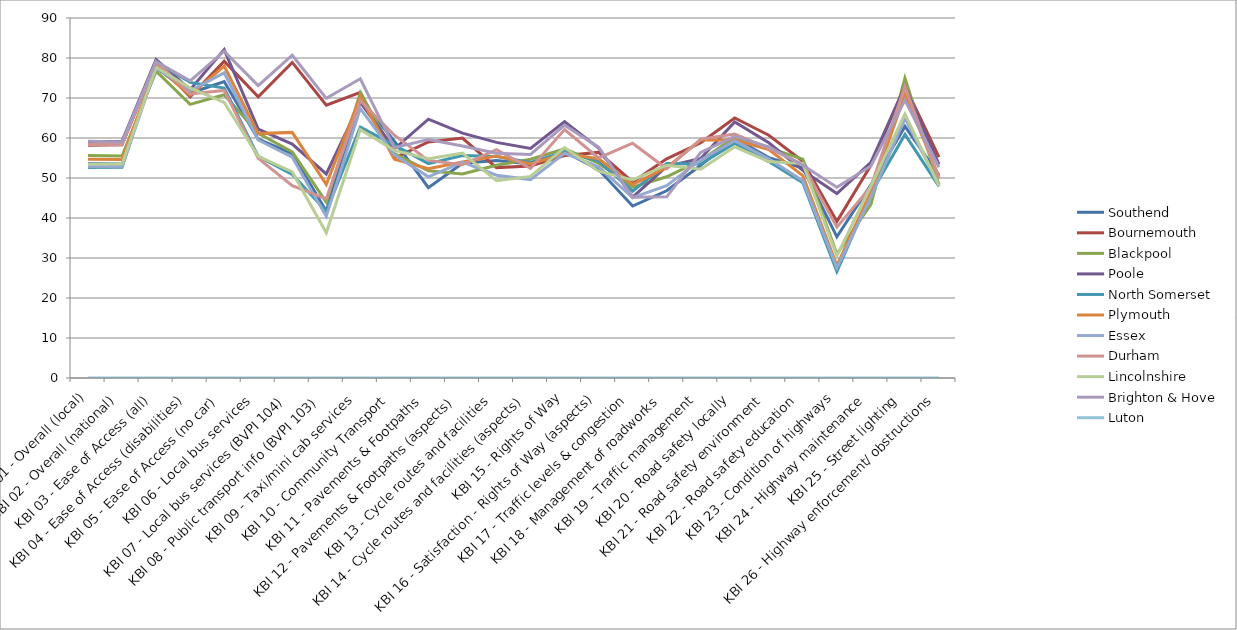
| Category | Southend | Bournemouth | Blackpool | Poole | North Somerset | Plymouth | Essex | Durham | Lincolnshire | Brighton & Hove | Luton |
|---|---|---|---|---|---|---|---|---|---|---|---|
| KBI 01 - Overall (local) | 53.6 | 58.2 | 55.6 | 59.1 | 52.6 | 54.7 | 52.8 | 58.4 | 53.5 | 59.2 | 0 |
| KBI 02 - Overall (national) | 53.5 | 58.3 | 55.5 | 59.2 | 52.7 | 54.6 | 52.8 | 58.3 | 53.5 | 59 | 0 |
| KBI 03 - Ease of Access (all) | 77.6 | 79.1 | 76.7 | 79.6 | 79 | 78 | 77.6 | 79.1 | 77.7 | 79.1 | 0 |
| KBI 04 - Ease of Access (disabilities) | 71.2 | 70.3 | 68.4 | 72.1 | 73.9 | 70.7 | 71.8 | 71 | 72.5 | 74.3 | 0 |
| KBI 05 - Ease of Access (no car) | 74.1 | 79.2 | 70.8 | 82.1 | 72.5 | 78 | 76.3 | 71.9 | 68.9 | 81.7 | 0 |
| KBI 06 - Local bus services | 59.7 | 70.3 | 61.2 | 62.2 | 55.4 | 61.1 | 59.5 | 54.9 | 55.4 | 73.1 | 0 |
| KBI 07 - Local bus services (BVPI 104) | 56.1 | 78.9 | 56.5 | 58.5 | 50.9 | 61.4 | 55.2 | 48.1 | 51.5 | 80.7 | 0 |
| KBI 08 - Public transport info (BVPI 103) | 41.7 | 68.2 | 44 | 51 | 41.7 | 48.4 | 40.4 | 44.8 | 36.3 | 69.9 | 0 |
| KBI 09 - Taxi/mini cab services | 69.8 | 71.4 | 71.3 | 68.9 | 62.7 | 70.3 | 67.4 | 69.3 | 62.1 | 74.8 | 0 |
| KBI 10 - Community Transport | 59.2 | 55 | 56.1 | 57.3 | 58.2 | 54.7 | 55.8 | 60.7 | 56.9 | 57.6 | 0 |
| KBI 11 - Pavements & Footpaths | 47.6 | 59 | 51.8 | 64.7 | 53.6 | 52.3 | 50.3 | 54.4 | 54.8 | 59.6 | 0 |
| KBI 12 - Pavements & Footpaths (aspects) | 53.7 | 60 | 51 | 61.2 | 55.6 | 54 | 54 | 53.3 | 56.2 | 58 | 0 |
| KBI 13 - Cycle routes and facilities | 54.4 | 52.6 | 53.2 | 58.9 | 55.4 | 55.5 | 50.7 | 57.1 | 49.3 | 56.2 | 0 |
| KBI 14 - Cycle routes and facilities (aspects) | 53.5 | 53 | 54.7 | 57.4 | 53.9 | 53.5 | 49.6 | 52.4 | 50.4 | 55.9 | 0 |
| KBI 15 - Rights of Way | 56.6 | 55.6 | 57.3 | 64.1 | 56.5 | 56.1 | 56.2 | 62.1 | 57.6 | 63.2 | 0 |
| KBI 16 - Satisfaction - Rights of Way (aspects) | 52.1 | 56.4 | 53.7 | 57.5 | 54.3 | 54.8 | 52.8 | 55 | 51.7 | 57.7 | 0 |
| KBI 17 - Traffic levels & congestion | 43 | 49 | 47.7 | 45.2 | 46.7 | 48.4 | 45.1 | 58.7 | 49.5 | 45.2 | 0 |
| KBI 18 - Management of roadworks | 46.8 | 54.8 | 50.3 | 52.9 | 53.6 | 52.6 | 48.1 | 52.3 | 53.2 | 45.3 | 0 |
| KBI 19 - Traffic management | 53.2 | 58.8 | 54.4 | 54.9 | 53.5 | 59.5 | 54.5 | 59.7 | 52.2 | 56.4 | 0 |
| KBI 20 - Road safety locally | 59.9 | 65 | 60.2 | 64 | 58.7 | 59.5 | 59.3 | 61 | 57.8 | 60.4 | 0 |
| KBI 21 - Road safety environment | 55.1 | 60.7 | 57.5 | 58.8 | 54.1 | 57.1 | 54.8 | 57.4 | 54.1 | 57.8 | 0 |
| KBI 22 - Road safety education | 52.5 | 54.2 | 54.7 | 51.9 | 48.8 | 50.6 | 49.3 | 53.4 | 53.6 | 53.2 | 0 |
| KBI 23 - Condition of highways | 35.3 | 39.1 | 31 | 46.1 | 26.6 | 28.1 | 27.5 | 37.7 | 30.5 | 47.7 | 0 |
| KBI 24 - Highway maintenance | 48.3 | 53.2 | 43.4 | 53.9 | 46.1 | 46.5 | 45.2 | 47.8 | 48 | 53 | 0 |
| KBI 25 - Street lighting | 62.9 | 73 | 75 | 72.9 | 60.9 | 70.9 | 64.9 | 72.9 | 66 | 69.5 | 0 |
| KBI 26 - Highway enforcement/ obstructions | 50.7 | 55.2 | 48.3 | 53.4 | 47.9 | 50.3 | 48.3 | 49.8 | 48 | 52.7 | 0 |